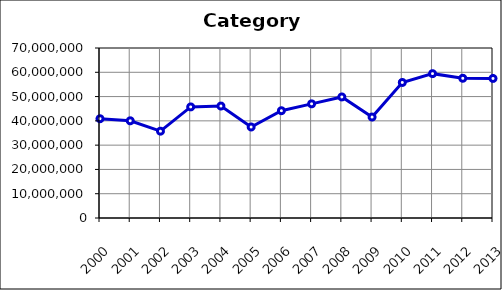
| Category | Category 1 |
|---|---|
| 2000.0 | 40876726 |
| 2001.0 | 40022329 |
| 2002.0 | 35752745 |
| 2003.0 | 45744604 |
| 2004.0 | 46097753 |
| 2005.0 | 37477964 |
| 2006.0 | 44177733 |
| 2007.0 | 47006743 |
| 2008.0 | 49839764 |
| 2009.0 | 41571659 |
| 2010.0 | 55810488 |
| 2011.0 | 59439084 |
| 2012.0 | 57538344 |
| 2013.0 | 57464576 |